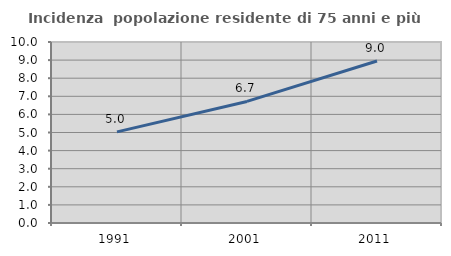
| Category | Incidenza  popolazione residente di 75 anni e più |
|---|---|
| 1991.0 | 5.033 |
| 2001.0 | 6.717 |
| 2011.0 | 8.95 |